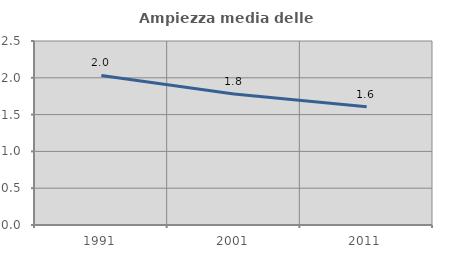
| Category | Ampiezza media delle famiglie |
|---|---|
| 1991.0 | 2.032 |
| 2001.0 | 1.781 |
| 2011.0 | 1.607 |